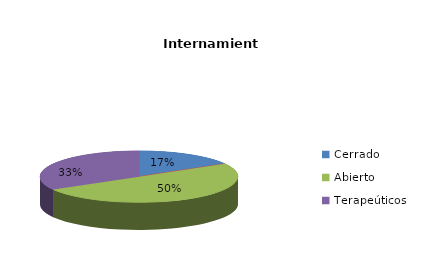
| Category | Series 0 |
|---|---|
| Cerrado | 1 |
| Semiabierto | 0 |
| Abierto | 3 |
| Terapeúticos | 2 |